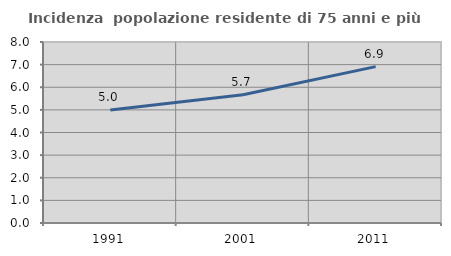
| Category | Incidenza  popolazione residente di 75 anni e più |
|---|---|
| 1991.0 | 4.996 |
| 2001.0 | 5.669 |
| 2011.0 | 6.912 |